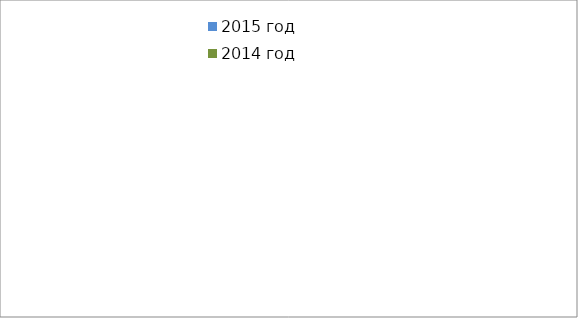
| Category | 2015 год | 2014 год |
|---|---|---|
|  - поджог | 19 | 20 |
|  - неосторожное обращение с огнём | 57 | 37 |
|  - НПТЭ электрооборудования | 9 | 18 |
|  - НПУ и Э печей | 57 | 54 |
|  - НПУ и Э транспортных средств | 42 | 49 |
|   -Шалость с огнем детей | 3 | 0 |
|  -НППБ при эксплуатации эл.приборов | 12 | 18 |
|  - курение | 20 | 19 |
| - прочие | 76 | 77 |
| - не установленные причины | 9 | 8 |